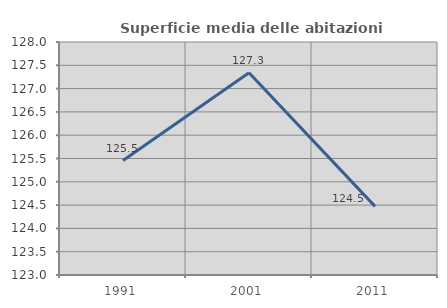
| Category | Superficie media delle abitazioni occupate |
|---|---|
| 1991.0 | 125.457 |
| 2001.0 | 127.341 |
| 2011.0 | 124.472 |